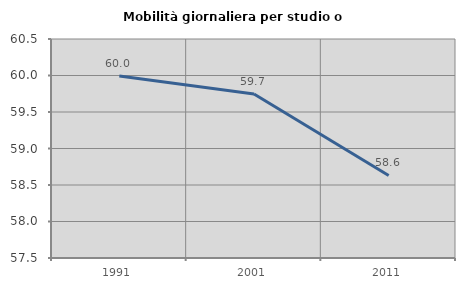
| Category | Mobilità giornaliera per studio o lavoro |
|---|---|
| 1991.0 | 59.992 |
| 2001.0 | 59.746 |
| 2011.0 | 58.63 |